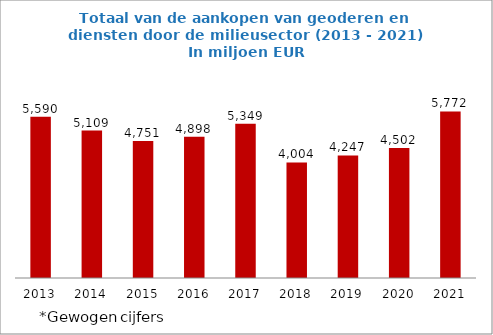
| Category | Totaal van de aankopen van goederen en diensten |
|---|---|
| 2013.0 | 5590.179 |
| 2014.0 | 5108.615 |
| 2015.0 | 4751.181 |
| 2016.0 | 4898.013 |
| 2017.0 | 5348.922 |
| 2018.0 | 4003.71 |
| 2019.0 | 4246.675 |
| 2020.0 | 4502.204 |
| 2021.0 | 5772.287 |